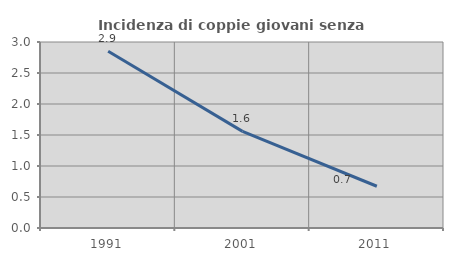
| Category | Incidenza di coppie giovani senza figli |
|---|---|
| 1991.0 | 2.85 |
| 2001.0 | 1.558 |
| 2011.0 | 0.673 |